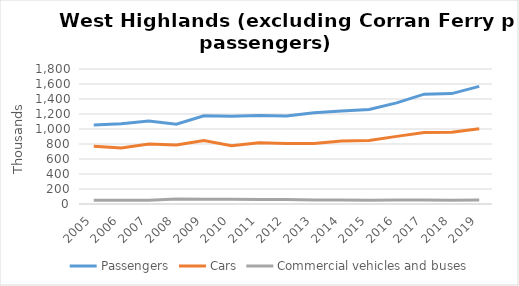
| Category | Passengers | Cars | Commercial vehicles and buses |
|---|---|---|---|
| 2005.0 | 1054.617 | 770.238 | 48.567 |
| 2006.0 | 1068.882 | 746.445 | 48.86 |
| 2007.0 | 1107.978 | 798.89 | 48.652 |
| 2008.0 | 1064.625 | 787.283 | 65.255 |
| 2009.0 | 1176.518 | 845.385 | 63.839 |
| 2010.0 | 1169.161 | 777.079 | 61.793 |
| 2011.0 | 1180.321 | 815.351 | 59.327 |
| 2012.0 | 1172.348 | 805.243 | 60.663 |
| 2013.0 | 1215.379 | 805.499 | 52.702 |
| 2014.0 | 1241 | 838.5 | 52.94 |
| 2015.0 | 1261 | 845.4 | 51.48 |
| 2016.0 | 1348.76 | 901.887 | 51.915 |
| 2017.0 | 1464.9 | 952.7 | 54.24 |
| 2018.0 | 1472.1 | 957.8 | 51.4 |
| 2019.0 | 1568 | 1003.498 | 52.014 |